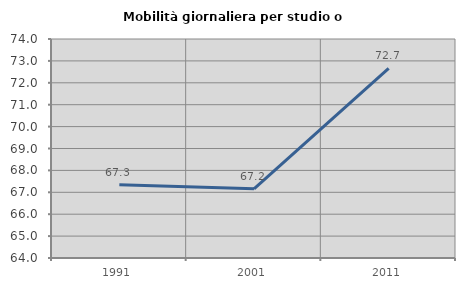
| Category | Mobilità giornaliera per studio o lavoro |
|---|---|
| 1991.0 | 67.343 |
| 2001.0 | 67.157 |
| 2011.0 | 72.657 |